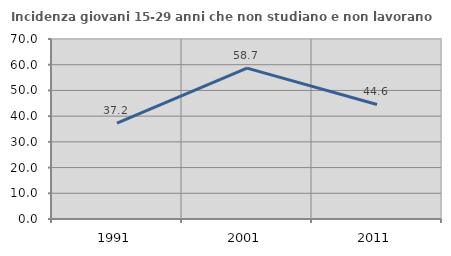
| Category | Incidenza giovani 15-29 anni che non studiano e non lavorano  |
|---|---|
| 1991.0 | 37.247 |
| 2001.0 | 58.69 |
| 2011.0 | 44.551 |